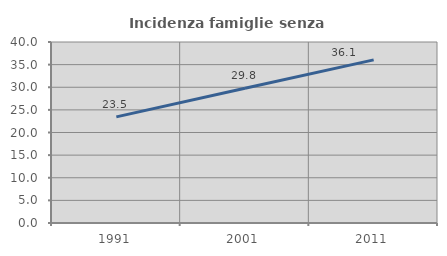
| Category | Incidenza famiglie senza nuclei |
|---|---|
| 1991.0 | 23.452 |
| 2001.0 | 29.797 |
| 2011.0 | 36.055 |